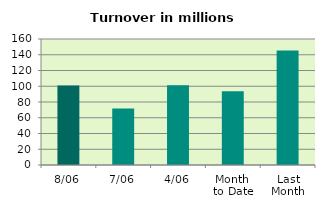
| Category | Series 0 |
|---|---|
| 8/06 | 101.076 |
| 7/06 | 71.846 |
| 4/06 | 101.133 |
| Month 
to Date | 93.494 |
| Last
Month | 145.388 |